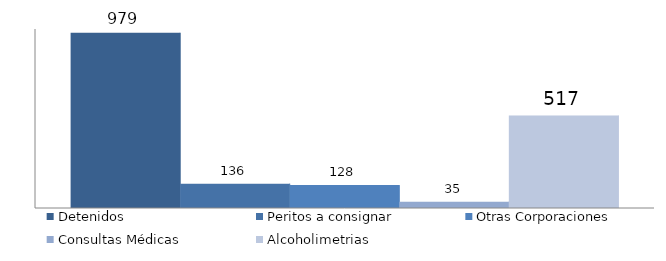
| Category | Detenidos | Peritos a consignar | Otras Corporaciones | Consultas Médicas | Alcoholimetrias |
|---|---|---|---|---|---|
| 0 | 979 | 136 | 128 | 35 | 517 |